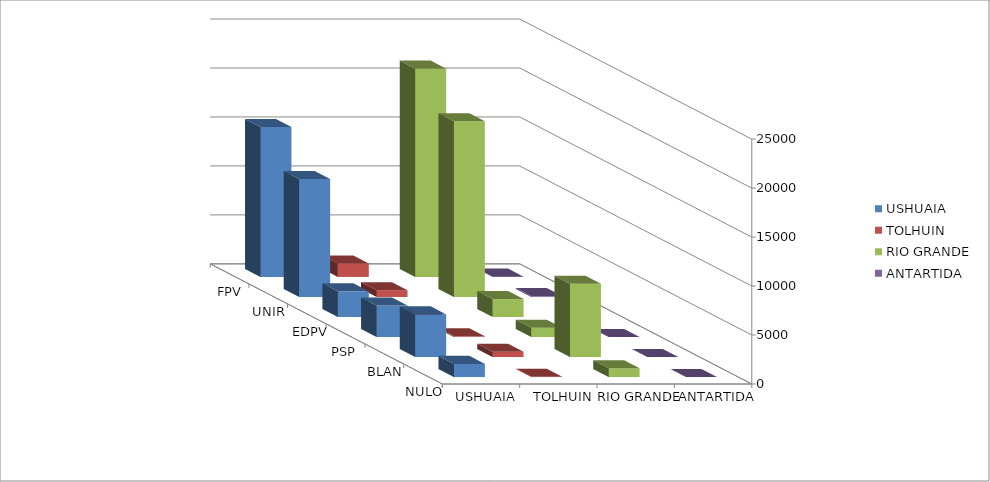
| Category | USHUAIA | TOLHUIN | RIO GRANDE | ANTARTIDA |
|---|---|---|---|---|
| FPV + FORJA | 15310 | 1383 | 21269 | 32 |
| UNIR TDF | 12054 | 694 | 17946 | 87 |
| EDPV | 2620 | 28 | 1833 | 7 |
| PSP | 3223 | 67 | 952 | 9 |
| BLANCO | 4356 | 539 | 7488 | 6 |
| NULOS | 1346 | 27 | 908 | 6 |